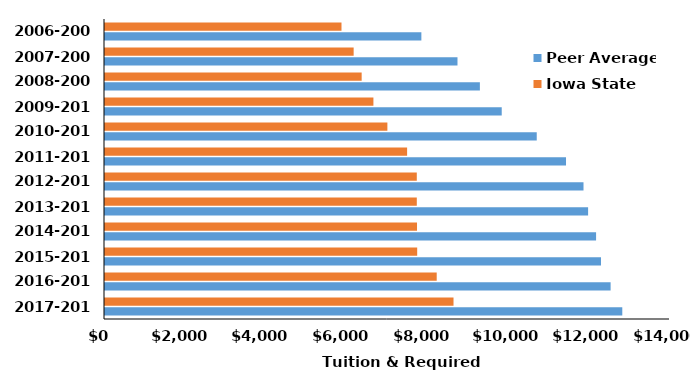
| Category | Peer Average | Iowa State |
|---|---|---|
| 2017-2018 | 12817.8 | 8635.9 |
| 2016-2017 | 12528.628 | 8219.4 |
| 2015-2016 | 12290.456 | 7735.9 |
| 2014-2015 | 12168.48 | 7731.4 |
| 2013-2014 | 11970.78 | 7726 |
| 2012-2013 | 11856.7 | 7726 |
| 2011-2012 | 11423.4 | 7486 |
| 2010-2011 | 10698.1 | 6997 |
| 2009-2010 | 9830.583 | 6651 |
| 2008-2009 | 9289.001 | 6360 |
| 2007-2008 | 8734.088 | 6161.32 |
| 2006-2007 | 7839.415 | 5860 |